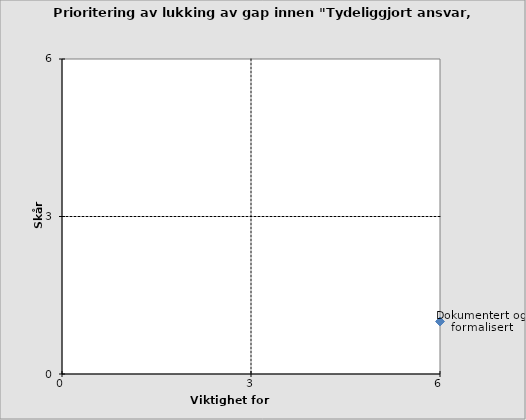
| Category | Dokumentert og formalisert |
|---|---|
| 6.0 | 1 |